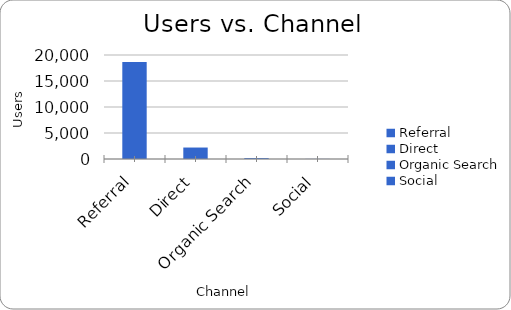
| Category | Series 0 |
|---|---|
| Referral | 18638 |
| Direct | 2205 |
| Organic Search | 175 |
| Social | 21 |